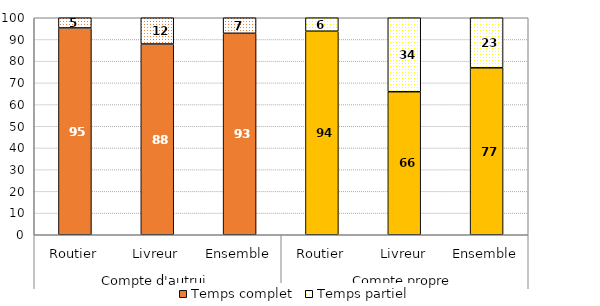
| Category | Temps complet | Temps partiel |
|---|---|---|
| 0 | 95.3 | 4.7 |
| 1 | 87.9 | 12.1 |
| 2 | 92.841 | 7.159 |
| 3 | 93.8 | 6.2 |
| 4 | 65.9 | 34.1 |
| 5 | 76.929 | 23.071 |